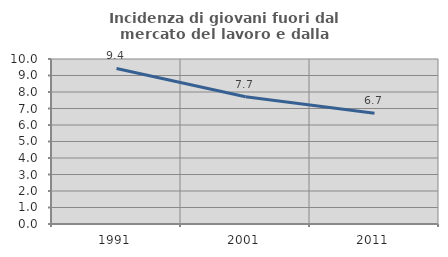
| Category | Incidenza di giovani fuori dal mercato del lavoro e dalla formazione  |
|---|---|
| 1991.0 | 9.425 |
| 2001.0 | 7.712 |
| 2011.0 | 6.709 |